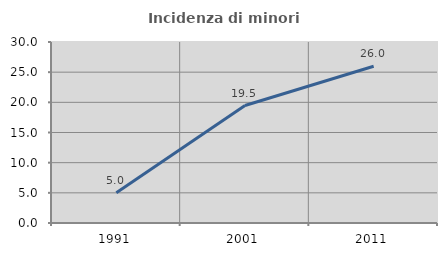
| Category | Incidenza di minori stranieri |
|---|---|
| 1991.0 | 5 |
| 2001.0 | 19.474 |
| 2011.0 | 25.983 |